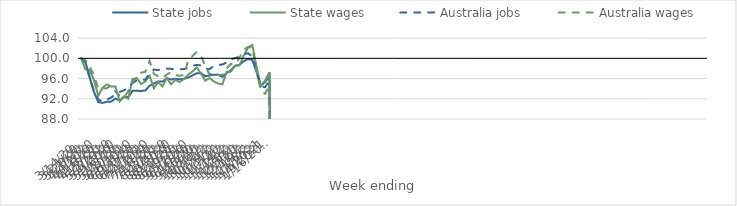
| Category | State jobs | State wages | Australia jobs | Australia wages |
|---|---|---|---|---|
| 14/03/2020 | 100 | 100 | 100 | 100 |
| 21/03/2020 | 99.289 | 97.822 | 99.215 | 99.668 |
| 28/03/2020 | 96.212 | 97.681 | 96.153 | 98.379 |
| 04/04/2020 | 93.354 | 95.641 | 93.502 | 96.626 |
| 11/04/2020 | 91.351 | 92.623 | 91.838 | 94.061 |
| 18/04/2020 | 91.178 | 94.167 | 91.448 | 93.977 |
| 25/04/2020 | 91.404 | 94.891 | 91.813 | 94.111 |
| 02/05/2020 | 91.436 | 94.426 | 92.231 | 94.578 |
| 09/05/2020 | 92.023 | 94.445 | 92.806 | 93.416 |
| 16/05/2020 | 91.685 | 91.488 | 93.353 | 92.605 |
| 23/05/2020 | 92.335 | 92.463 | 93.674 | 92.236 |
| 30/05/2020 | 92.332 | 92.044 | 94.181 | 93.508 |
| 06/06/2020 | 93.584 | 95.87 | 95.128 | 95.497 |
| 13/06/2020 | 93.594 | 96.086 | 95.639 | 96.189 |
| 20/06/2020 | 93.538 | 94.914 | 95.802 | 97.174 |
| 27/06/2020 | 93.655 | 95.425 | 95.768 | 97.323 |
| 04/07/2020 | 94.565 | 96.528 | 97.053 | 99.476 |
| 11/07/2020 | 95.006 | 94.091 | 97.772 | 96.928 |
| 18/07/2020 | 95.412 | 95.283 | 97.691 | 96.451 |
| 25/07/2020 | 95.403 | 94.449 | 97.829 | 96.097 |
| 01/08/2020 | 96.052 | 96.124 | 97.979 | 96.806 |
| 08/08/2020 | 95.807 | 94.872 | 97.922 | 97.248 |
| 15/08/2020 | 95.952 | 95.734 | 97.789 | 96.723 |
| 22/08/2020 | 95.867 | 95.311 | 97.812 | 96.531 |
| 29/08/2020 | 95.943 | 95.904 | 97.884 | 96.715 |
| 05/09/2020 | 96.206 | 96.766 | 98.101 | 99.468 |
| 12/09/2020 | 96.605 | 97.371 | 98.536 | 100.455 |
| 19/09/2020 | 97.047 | 98.212 | 98.701 | 101.226 |
| 26/09/2020 | 97.076 | 97.04 | 98.574 | 100.61 |
| 03/10/2020 | 96.459 | 95.583 | 97.954 | 98.463 |
| 10/10/2020 | 96.61 | 96.104 | 97.882 | 96.815 |
| 17/10/2020 | 96.768 | 95.425 | 98.486 | 97.316 |
| 24/10/2020 | 96.74 | 95.022 | 98.675 | 96.732 |
| 31/10/2020 | 96.334 | 94.852 | 98.779 | 96.679 |
| 07/11/2020 | 97.064 | 97.308 | 99.161 | 98.026 |
| 14/11/2020 | 97.654 | 97.369 | 99.803 | 98.893 |
| 21/11/2020 | 98.515 | 98.563 | 100.059 | 98.847 |
| 28/11/2020 | 98.722 | 98.571 | 100.31 | 100.101 |
| 05/12/2020 | 99.432 | 100.55 | 100.817 | 101.732 |
| 12/12/2020 | 99.865 | 102.097 | 101.015 | 102.219 |
| 19/12/2020 | 99.681 | 102.632 | 100.355 | 102.16 |
| 26/12/2020 | 97.3 | 98.303 | 97.322 | 97.485 |
| 02/01/2021 | 94.55 | 94.497 | 94.445 | 93.574 |
| 09/01/2021 | 95.346 | 95.627 | 94.284 | 92.978 |
| 16/01/2021 | 96.485 | 97.248 | 95.7 | 94.76 |